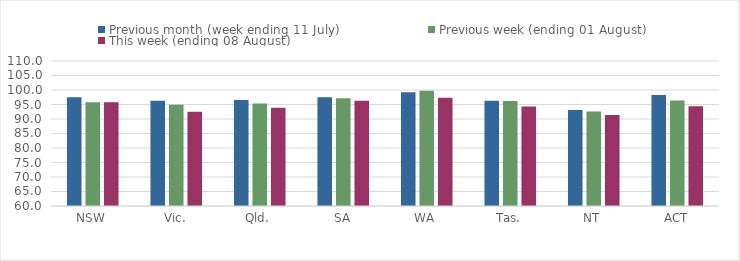
| Category | Previous month (week ending 11 July) | Previous week (ending 01 August) | This week (ending 08 August) |
|---|---|---|---|
| NSW | 97.466 | 95.779 | 95.779 |
| Vic. | 96.251 | 94.892 | 92.485 |
| Qld. | 96.59 | 95.309 | 93.844 |
| SA | 97.501 | 97.156 | 96.285 |
| WA | 99.26 | 99.722 | 97.33 |
| Tas. | 96.275 | 96.179 | 94.35 |
| NT | 93.078 | 92.619 | 91.347 |
| ACT | 98.293 | 96.352 | 94.427 |